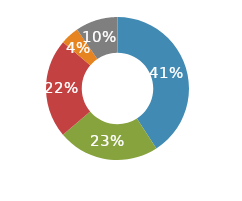
| Category | Series 0 |
|---|---|
| Transportation | 0.409 |
| Lodging | 0.23 |
| Food | 0.224 |
| Entertainment | 0.042 |
| Other | 0.096 |